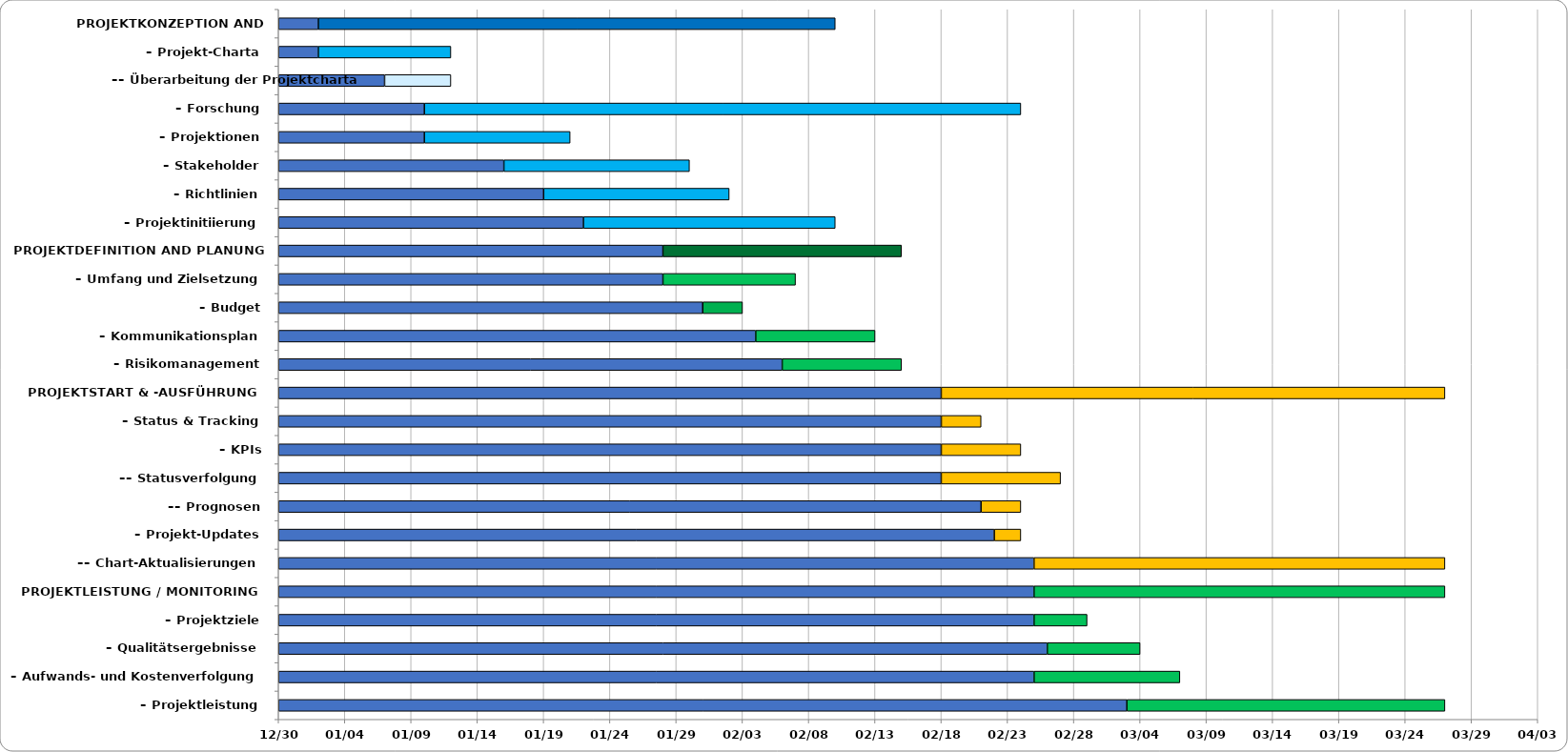
| Category | STARTDATUM | DAUER in Tagen |
|---|---|---|
| PROJEKTKONZEPTION AND INITIIERUNG | 2024-01-02 | 39 |
| – Projekt-Charta | 2024-01-02 | 10 |
| –– Überarbeitung der Projektcharta | 2024-01-07 | 5 |
| – Forschung | 2024-01-10 | 45 |
| – Projektionen | 2024-01-10 | 11 |
| – Stakeholder | 2024-01-16 | 14 |
| – Richtlinien | 2024-01-19 | 14 |
| – Projektinitiierung | 2024-01-22 | 19 |
| PROJEKTDEFINITION AND PLANUNG | 2024-01-28 | 18 |
| – Umfang und Zielsetzung | 2024-01-28 | 10 |
| – Budget | 2024-01-31 | 3 |
| – Kommunikationsplan | 2024-02-04 | 9 |
| – Risikomanagement | 2024-02-06 | 9 |
| PROJEKTSTART & -AUSFÜHRUNG | 2024-02-18 | 38 |
| – Status & Tracking | 2024-02-18 | 3 |
| – KPIs | 2024-02-18 | 6 |
| –– Statusverfolgung | 2024-02-18 | 9 |
| –– Prognosen | 2024-02-21 | 3 |
| – Projekt-Updates | 2024-02-22 | 2 |
| –– Chart-Aktualisierungen | 2024-02-25 | 31 |
| PROJEKTLEISTUNG / MONITORING | 2024-02-25 | 31 |
| – Projektziele | 2024-02-25 | 4 |
| – Qualitätsergebnisse | 2024-02-26 | 7 |
| – Aufwands- und Kostenverfolgung | 2024-02-25 | 11 |
| – Projektleistung | 2024-03-03 | 24 |